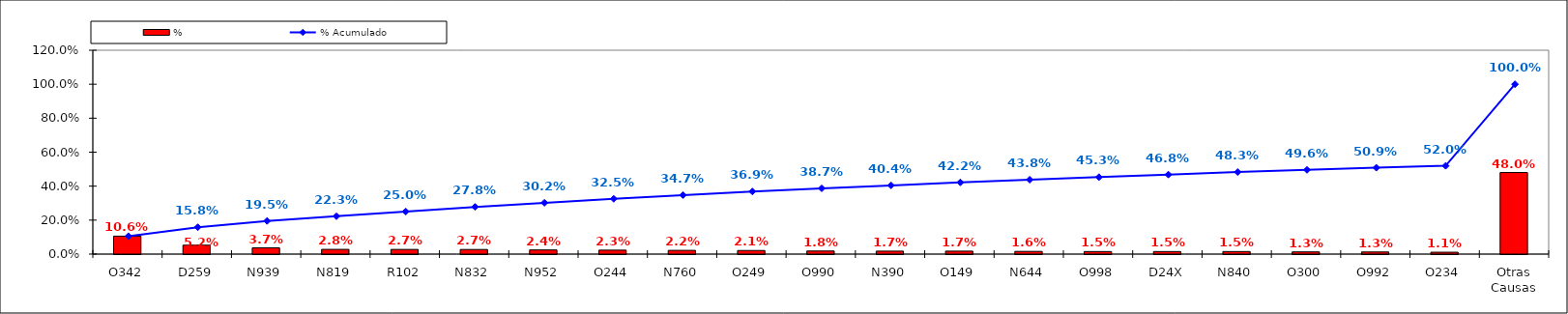
| Category | % |
|---|---|
| O342 | 0.106 |
| D259 | 0.052 |
| N939 | 0.037 |
| N819 | 0.028 |
| R102 | 0.027 |
| N832 | 0.027 |
| N952 | 0.024 |
| O244 | 0.023 |
| N760 | 0.022 |
| O249 | 0.021 |
| O990 | 0.018 |
| N390 | 0.017 |
| O149 | 0.017 |
| N644 | 0.016 |
| O998 | 0.015 |
| D24X | 0.015 |
| N840 | 0.015 |
| O300 | 0.013 |
| O992 | 0.013 |
| O234 | 0.011 |
| Otras Causas | 0.48 |